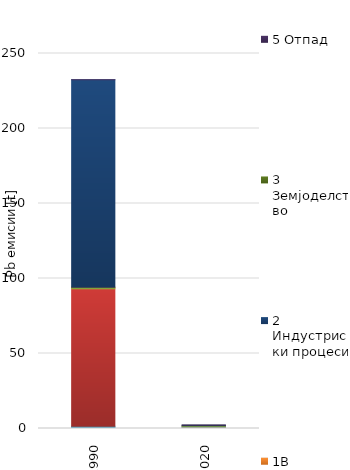
| Category | 1A1 | 1A2 | 1A3 | 1A4 | 1A5 | 1B | 2 | 3 | 5 |
|---|---|---|---|---|---|---|---|---|---|
| 1990.0 | 0.897 | 0.581 | 91.613 | 1.128 | 0 | 0.006 | 138.251 | 0 | 0.008 |
| 2020.0 | 0.436 | 0.552 | 0.239 | 0.661 | 0 | 0 | 0.305 | 0 | 0.074 |